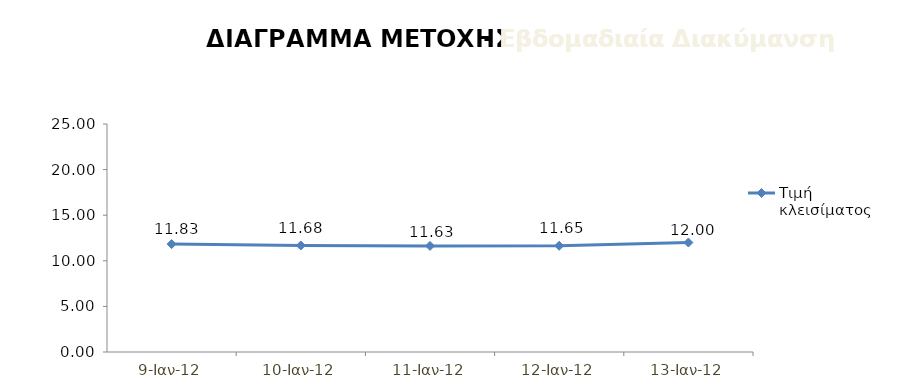
| Category | Τιμή κλεισίματος |
|---|---|
| 2012-01-09 | 11.83 |
| 2012-01-10 | 11.68 |
| 2012-01-11 | 11.63 |
| 2012-01-12 | 11.65 |
| 2012-01-13 | 12 |